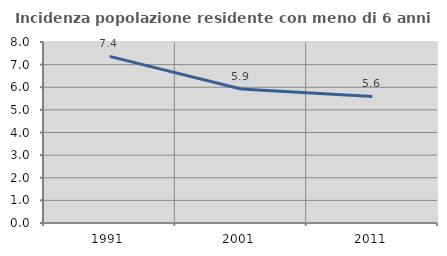
| Category | Incidenza popolazione residente con meno di 6 anni |
|---|---|
| 1991.0 | 7.363 |
| 2001.0 | 5.92 |
| 2011.0 | 5.591 |